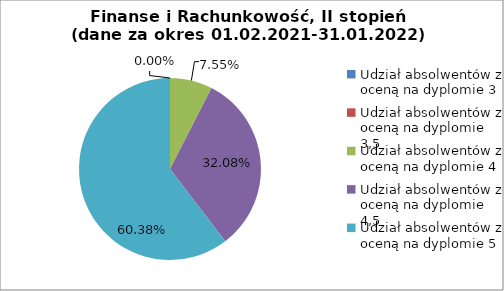
| Category | Series 0 |
|---|---|
| Udział absolwentów z oceną na dyplomie 3 | 0 |
| Udział absolwentów z oceną na dyplomie 3,5 | 0 |
| Udział absolwentów z oceną na dyplomie 4 | 7.547 |
| Udział absolwentów z oceną na dyplomie 4,5 | 32.075 |
| Udział absolwentów z oceną na dyplomie 5 | 60.377 |